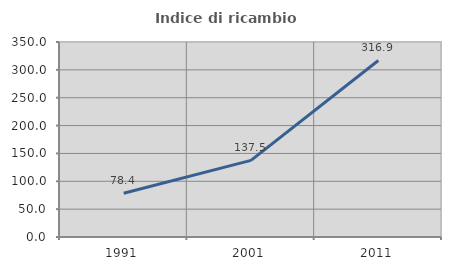
| Category | Indice di ricambio occupazionale  |
|---|---|
| 1991.0 | 78.403 |
| 2001.0 | 137.5 |
| 2011.0 | 316.879 |